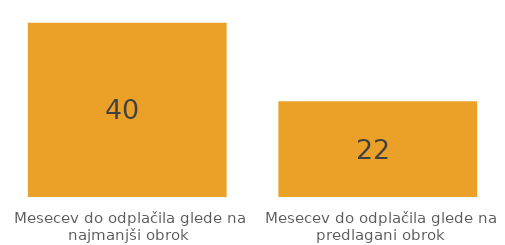
| Category | Series 0 |
|---|---|
| Mesecev do odplačila glede na najmanjši obrok | 40 |
| Mesecev do odplačila glede na predlagani obrok | 22 |